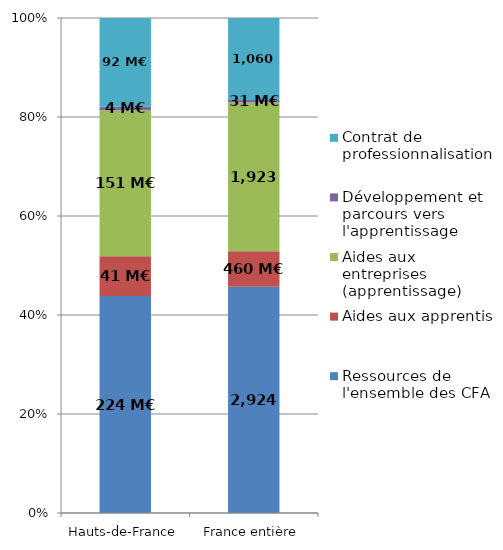
| Category | Ressources de l'ensemble des CFA | Aides aux apprentis | Aides aux entreprises (apprentissage) | Développement et parcours vers l'apprentissage | Contrat de professionnalisation |
|---|---|---|---|---|---|
| Hauts-de-France | 224.12 | 41.299 | 150.86 | 3.559 | 91.696 |
| France entière | 2924.219 | 459.796 | 1923.184 | 31.421 | 1060.48 |